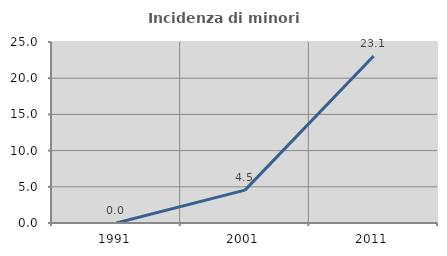
| Category | Incidenza di minori stranieri |
|---|---|
| 1991.0 | 0 |
| 2001.0 | 4.545 |
| 2011.0 | 23.077 |